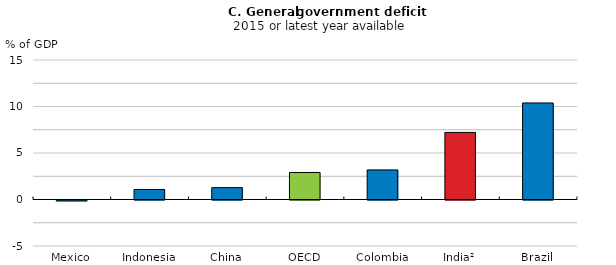
| Category | Series 0 |
|---|---|
| Mexico | -0.095 |
| Indonesia | 1.078 |
| China | 1.277 |
| OECD | 2.906 |
| Colombia | 3.18 |
| India² | 7.213 |
| Brazil | 10.383 |